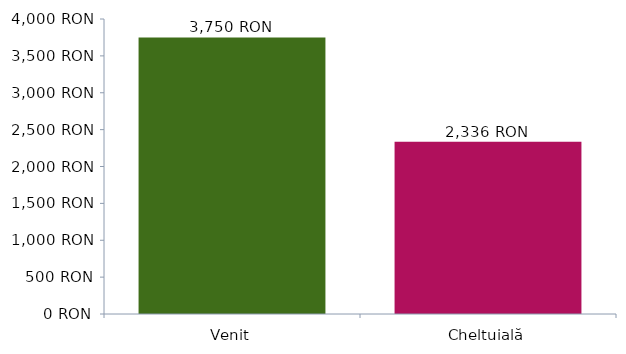
| Category | DateDiagramă |
|---|---|
| 0 | 3750 |
| 1 | 2336 |